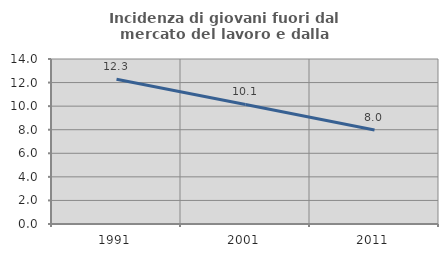
| Category | Incidenza di giovani fuori dal mercato del lavoro e dalla formazione  |
|---|---|
| 1991.0 | 12.279 |
| 2001.0 | 10.147 |
| 2011.0 | 7.983 |